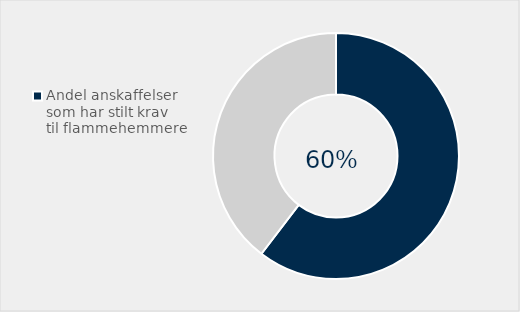
| Category | Series 0 |
|---|---|
| Andel anskaffelser som har stilt krav til flammehemmere | 0.604 |
| Ikke stilt krav | 0.396 |